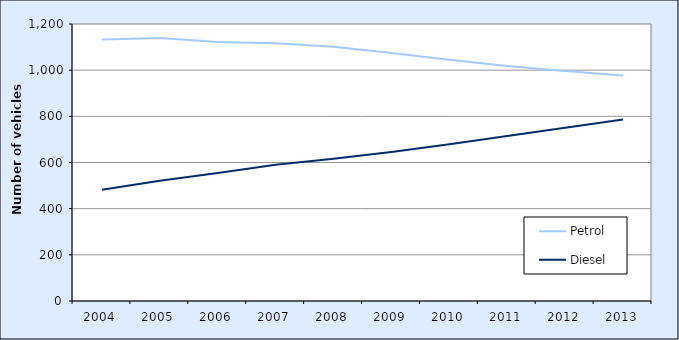
| Category | Petrol | Diesel |
|---|---|---|
| 2004.0 | 1132.475 | 481.54 |
| 2005.0 | 1139.103 | 521.299 |
| 2006.0 | 1122.278 | 554.111 |
| 2007.0 | 1116.471 | 589.842 |
| 2008.0 | 1101.408 | 615.879 |
| 2009.0 | 1074.39 | 645.585 |
| 2010.0 | 1045.596 | 679.123 |
| 2011.0 | 1018.501 | 714.79 |
| 2012.0 | 996.228 | 750.541 |
| 2013.0 | 976.736 | 786.668 |